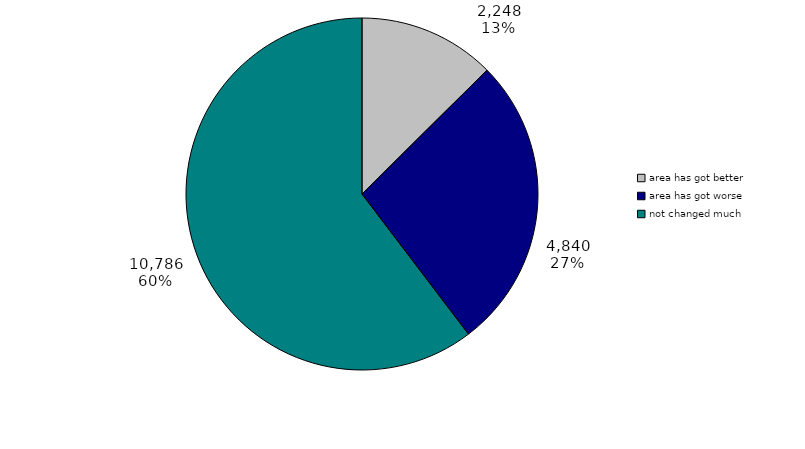
| Category | Series 0 |
|---|---|
| 0 | 2247.781 |
| 1 | 4840.491 |
| 2 | 10785.721 |